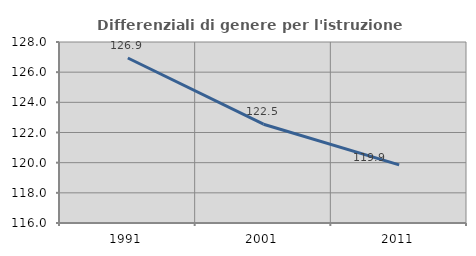
| Category | Differenziali di genere per l'istruzione superiore |
|---|---|
| 1991.0 | 126.938 |
| 2001.0 | 122.549 |
| 2011.0 | 119.857 |